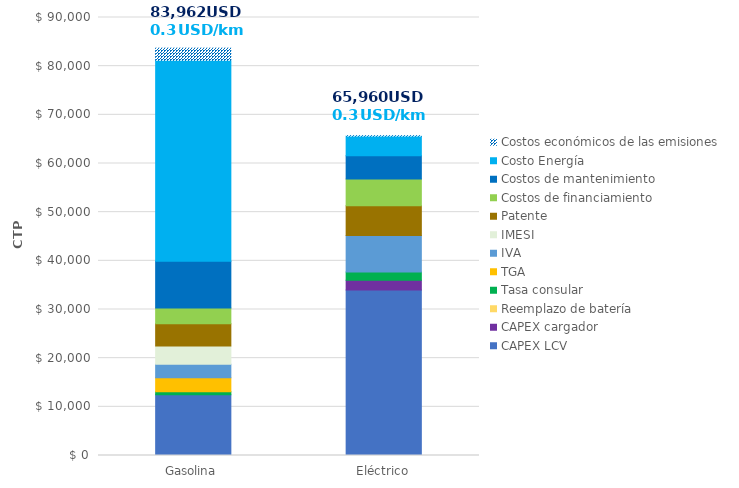
| Category | CAPEX LCV | CAPEX cargador | Reemplazo de batería | Tasa consular | TGA | IVA | IMESI | Patente | Costos de financiamiento | Costos de mantenimiento | Costo Energía | Costos económicos de las emisiones |
|---|---|---|---|---|---|---|---|---|---|---|---|---|
| Gasolina | 12500 | 0 | 0 | 625 | 2875 | 2750 | 3775 | 4562.5 | 3203.525 | 9600 | 41333.76 | 2467.2 |
| Eléctrico | 34000 | 2000 | 0 | 1700 | 0 | 7480 | 0 | 6120 | 5505.439 | 4800 | 4031.808 | 52.992 |